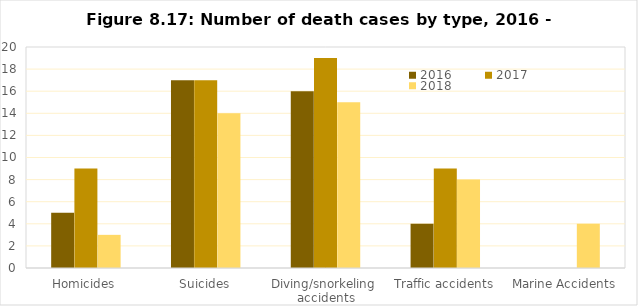
| Category | Series 1 | Series 2 | Series 3 | Series 0 | Series 4 | 2016  | 2017  | 2018  |
|---|---|---|---|---|---|---|---|---|
| Homicides |  |  |  |  |  | 5 | 9 | 3 |
| Suicides |  |  |  |  |  | 17 | 17 | 14 |
| Diving/snorkeling  accidents |  |  |  |  |  | 16 | 19 | 15 |
| Traffic accidents |  |  |  |  |  | 4 | 9 | 8 |
| Marine Accidents |  |  |  |  |  | 0 | 0 | 4 |